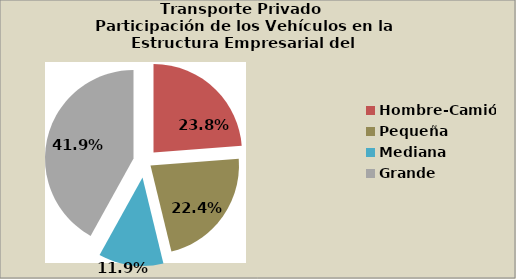
| Category | Series 0 |
|---|---|
| Hombre-Camión | 23.799 |
| Pequeña | 22.403 |
| Mediana | 11.859 |
| Grande | 41.939 |